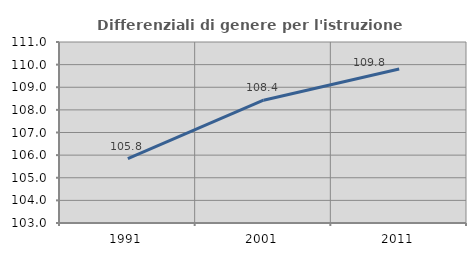
| Category | Differenziali di genere per l'istruzione superiore |
|---|---|
| 1991.0 | 105.843 |
| 2001.0 | 108.427 |
| 2011.0 | 109.806 |